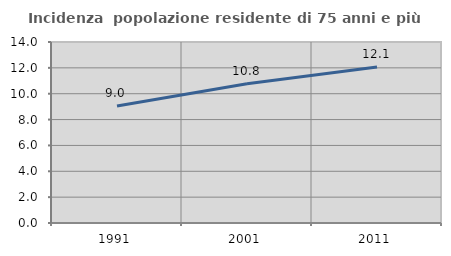
| Category | Incidenza  popolazione residente di 75 anni e più |
|---|---|
| 1991.0 | 9.047 |
| 2001.0 | 10.769 |
| 2011.0 | 12.071 |